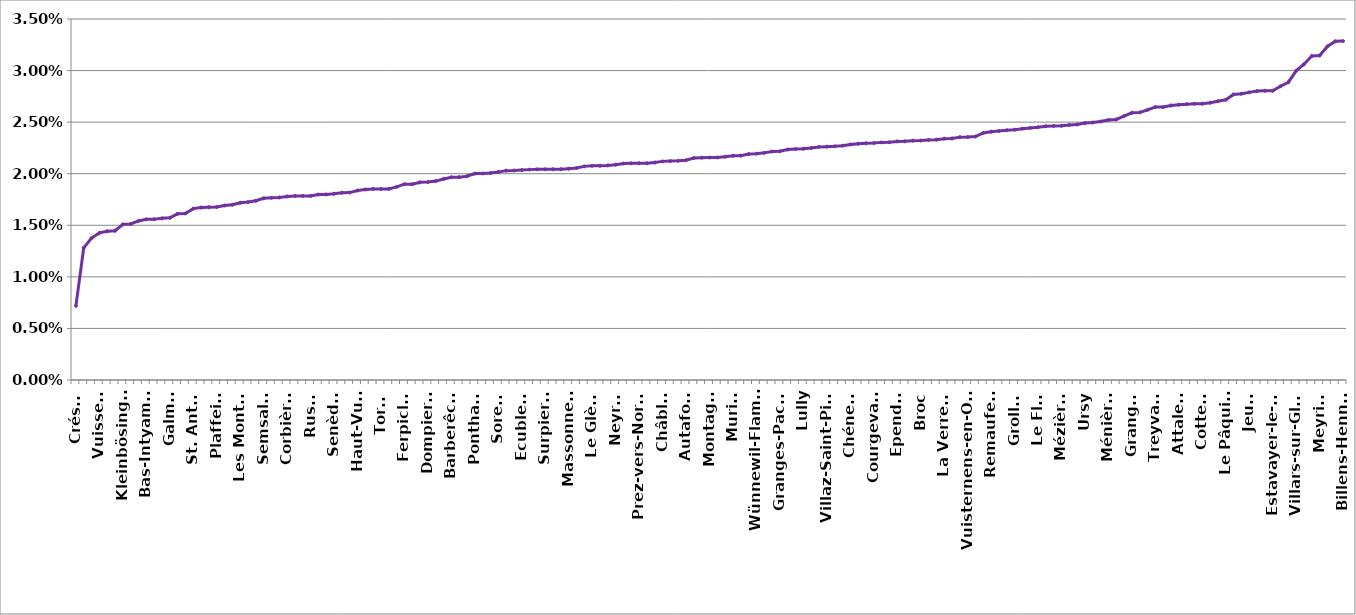
| Category | en % de la dépense initiale |
|---|---|
| Crésuz | 0.007 |
| Delley-Portalban | 0.013 |
| Plasselb | 0.014 |
| Vuissens | 0.014 |
| Châtillon | 0.014 |
| Rueyres-les-Prés | 0.014 |
| Kleinbösingen | 0.015 |
| Courlevon | 0.015 |
| Gletterens | 0.015 |
| Bas-Intyamon | 0.016 |
| Châtel-sur-Montsalvens | 0.016 |
| Rechthalten | 0.016 |
| Galmiz | 0.016 |
| St. Silvester | 0.016 |
| Cheyres | 0.016 |
| St. Antoni | 0.017 |
| Bussy | 0.017 |
| Léchelles | 0.017 |
| Plaffeien | 0.017 |
| Ueberstorf | 0.017 |
| Greng | 0.017 |
| Les Montets | 0.017 |
| Haut-Intyamon | 0.017 |
| Chésopelloz | 0.017 |
| Semsales | 0.018 |
| Botterens | 0.018 |
| Val-de-Charmey | 0.018 |
| Corbières | 0.018 |
| Hauteville | 0.018 |
| Brünisried | 0.018 |
| Russy | 0.018 |
| Grandvillard | 0.018 |
| Montet (Glâne) | 0.018 |
| Senèdes | 0.018 |
| Rue | 0.018 |
| Arconciel | 0.018 |
| Haut-Vully | 0.018 |
| Corserey | 0.018 |
| Heitenried | 0.019 |
| Torny | 0.019 |
| Alterswil | 0.019 |
| Grangettes | 0.019 |
| Ferpicloz | 0.019 |
| Misery-Courtion | 0.019 |
| Düdingen | 0.019 |
| Dompierre | 0.019 |
| Salvenach | 0.019 |
| Autigny | 0.019 |
| Barberêche | 0.02 |
| Muntelier | 0.02 |
| Villeneuve | 0.02 |
| Ponthaux | 0.02 |
| Pont-en-Ogoz | 0.02 |
| La Folliaz | 0.02 |
| Sorens | 0.02 |
| Cheiry | 0.02 |
| Chapelle (Glâne) | 0.02 |
| Ecublens | 0.02 |
| St. Ursen | 0.02 |
| Bösingen | 0.02 |
| Surpierre | 0.02 |
| Riaz | 0.02 |
| Ried bei Kerzers | 0.02 |
| Massonnens | 0.02 |
| Giffers | 0.021 |
| Gempenach | 0.021 |
| Le Glèbe | 0.021 |
| Villarepos | 0.021 |
| Saint-Aubin | 0.021 |
| Neyruz | 0.021 |
| Wallenried | 0.021 |
| Pierrafortscha | 0.021 |
| Prez-vers-Noréaz | 0.021 |
| Tentlingen | 0.021 |
| Corpataux-Magnedens | 0.021 |
| Châbles | 0.021 |
| Vallon | 0.021 |
| Cugy | 0.021 |
| Autafond | 0.021 |
| Tafers | 0.022 |
| La Brillaz | 0.022 |
| Montagny | 0.022 |
| Bas-Vully | 0.022 |
| Châtel-Saint-Denis | 0.022 |
| Murist | 0.022 |
| Gurmels | 0.022 |
| Gruyères | 0.022 |
| Wünnewil-Flamatt | 0.022 |
| Pont-la-Ville | 0.022 |
| Schmitten | 0.022 |
| Granges-Paccot | 0.022 |
| Morlon | 0.022 |
| Villorsonnens | 0.022 |
| Lully | 0.022 |
| Le Châtelard | 0.022 |
| Auboranges | 0.023 |
| Villaz-Saint-Pierre | 0.023 |
| Villarsel-sur-Marly | 0.023 |
| Echarlens | 0.023 |
| Chénens | 0.023 |
| Hauterive | 0.023 |
| La Roche | 0.023 |
| Courgevaux | 0.023 |
| Givisiez | 0.023 |
| Vaulruz | 0.023 |
| Ependes | 0.023 |
| Le Mouret | 0.023 |
| Belfaux | 0.023 |
| Broc | 0.023 |
| Noréaz | 0.023 |
| Marly | 0.023 |
| La Verrerie | 0.023 |
| Corminboeuf | 0.023 |
| Avry | 0.024 |
| Vuisternens-en-Ogoz | 0.024 |
| Lurtigen | 0.024 |
| Fétigny | 0.024 |
| Remaufens | 0.024 |
| Siviriez | 0.024 |
| Saint-Martin | 0.024 |
| Grolley | 0.024 |
| Jaun | 0.024 |
| Kerzers | 0.024 |
| Le Flon | 0.025 |
| Fräschels | 0.025 |
| Bulle | 0.025 |
| Mézières | 0.025 |
| Vernay | 0.025 |
| Morens | 0.025 |
| Ursy | 0.025 |
| La Sonnaz | 0.025 |
| Vuisternens-devant-Romont | 0.025 |
| Ménières | 0.025 |
| Cressier | 0.025 |
| Nuvilly | 0.026 |
| Granges | 0.026 |
| Romont | 0.026 |
| Bossonnens | 0.026 |
| Treyvaux | 0.026 |
| Ulmiz | 0.026 |
| Murten | 0.027 |
| Attalens | 0.027 |
| Zumholz | 0.027 |
| Oberschrot | 0.027 |
| Cottens | 0.027 |
| Sâles | 0.027 |
| Farvagny | 0.027 |
| Le Pâquier | 0.027 |
| Rossens | 0.028 |
| Fribourg | 0.028 |
| Jeuss | 0.028 |
| Vuadens | 0.028 |
| Domdidier | 0.028 |
| Estavayer-le-Lac | 0.028 |
| Châtonnaye | 0.028 |
| Courtepin | 0.029 |
| Villars-sur-Glâne | 0.03 |
| Sévaz | 0.031 |
| Matran | 0.031 |
| Meyriez | 0.031 |
| Marsens | 0.032 |
| Prévondavaux | 0.033 |
| Billens-Hennens | 0.033 |